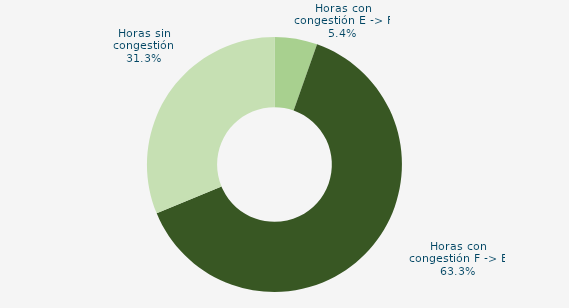
| Category | Horas con congestión E -> F |
|---|---|
| Horas con congestión E -> F | 5.417 |
| Horas con congestión F -> E | 63.333 |
| Horas sin congestión | 31.25 |